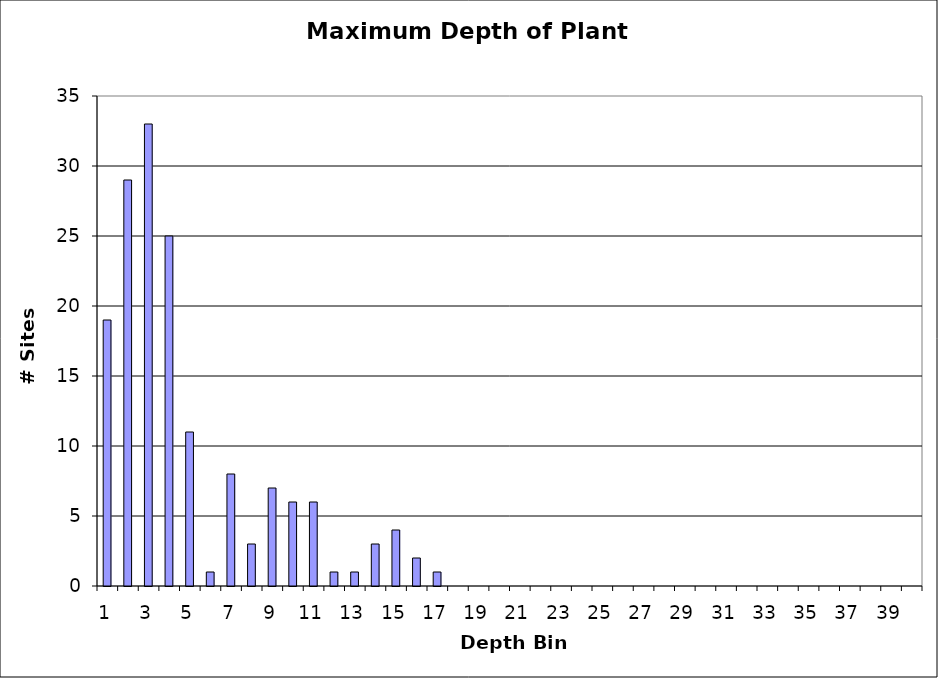
| Category | Series 0 |
|---|---|
| 1.0 | 19 |
| 2.0 | 29 |
| 3.0 | 33 |
| 4.0 | 25 |
| 5.0 | 11 |
| 6.0 | 1 |
| 7.0 | 8 |
| 8.0 | 3 |
| 9.0 | 7 |
| 10.0 | 6 |
| 11.0 | 6 |
| 12.0 | 1 |
| 13.0 | 1 |
| 14.0 | 3 |
| 15.0 | 4 |
| 16.0 | 2 |
| 17.0 | 1 |
| 18.0 | 0 |
| 19.0 | 0 |
| 20.0 | 0 |
| 21.0 | 0 |
| 22.0 | 0 |
| 23.0 | 0 |
| 24.0 | 0 |
| 25.0 | 0 |
| 26.0 | 0 |
| 27.0 | 0 |
| 28.0 | 0 |
| 29.0 | 0 |
| 30.0 | 0 |
| 31.0 | 0 |
| 32.0 | 0 |
| 33.0 | 0 |
| 34.0 | 0 |
| 35.0 | 0 |
| 36.0 | 0 |
| 37.0 | 0 |
| 38.0 | 0 |
| 39.0 | 0 |
| 40.0 | 0 |